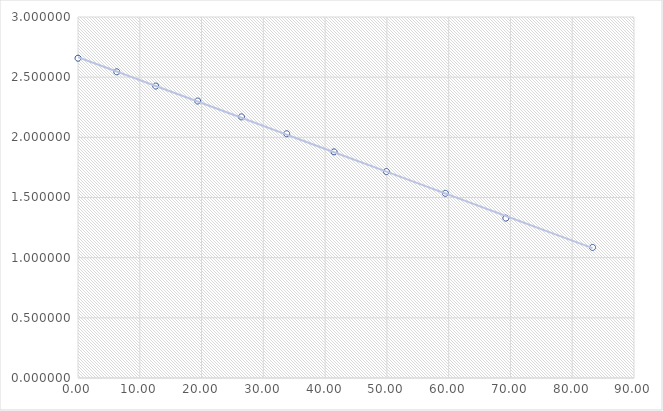
| Category | Velocità(m/s) |
|---|---|
| 0.0 | 2.658 |
| 6.27 | 2.545 |
| 12.58 | 2.426 |
| 19.37 | 2.302 |
| 26.46 | 2.17 |
| 33.78 | 2.03 |
| 41.45 | 1.879 |
| 49.93 | 1.716 |
| 59.47 | 1.534 |
| 69.26 | 1.329 |
| 83.29 | 1.085 |